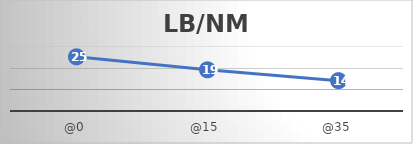
| Category | LB/NM |
|---|---|
| @0 | 25 |
| @15 | 19 |
| @35 | 14 |